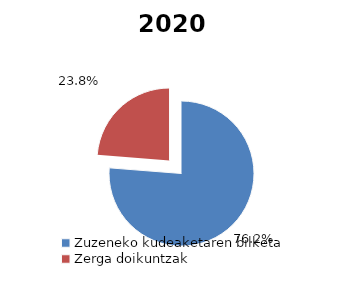
| Category | 2020 |
|---|---|
| Zuzeneko kudeaketaren bilketa | 2765478.468 |
| Zerga doikuntzak | 861600.135 |